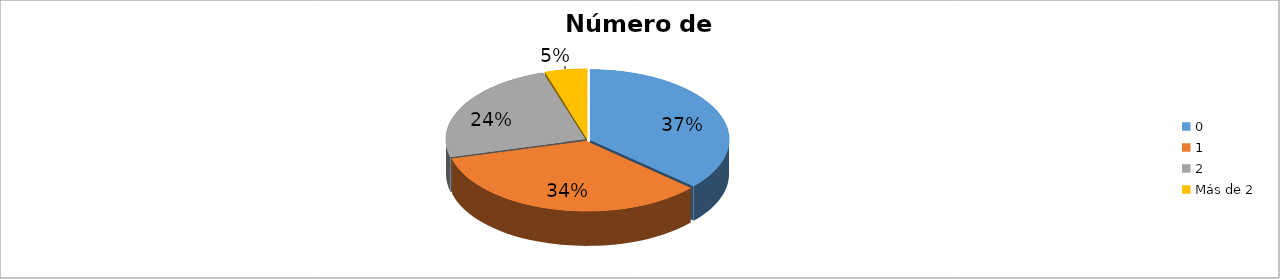
| Category | Series 0 |
|---|---|
| 0 | 0.366 |
| 1 | 0.343 |
| 2 | 0.242 |
| Más de 2 | 0.049 |